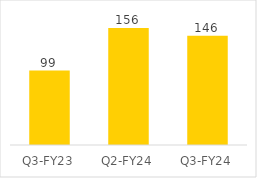
| Category | Series 0 |
|---|---|
| Q3-FY23 | 99.275 |
| Q2-FY24 | 156.087 |
| Q3-FY24 | 145.768 |